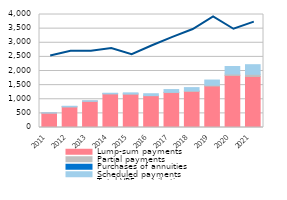
| Category | Lump-sum payments | Partial payments | Purchases of annuities | Scheduled payments |
|---|---|---|---|---|
| 2011.0 | 511.736 | 4.179 | 0 | 1.631 |
| 2012.0 | 732.82 | 0.095 | 0 | 18.744 |
| 2013.0 | 930.814 | 0.362 | 0 | 14.024 |
| 2014.0 | 1193.016 | 1.001 | 0 | 19.359 |
| 2015.0 | 1186.061 | 2.555 | 0 | 37.557 |
| 2016.0 | 1126.417 | 4.433 | 0 | 64.785 |
| 2017.0 | 1237.64 | 11.65 | 0 | 93.12 |
| 2018.0 | 1278.16 | 21.43 | 0 | 112.35 |
| 2019.0 | 1468.28 | 31.41 | 0 | 180.14 |
| 2020.0 | 1842.9 | 50.26 | 0 | 266.48 |
| 2021.0 | 1807.78 | 75.33 | 0 | 340.4 |